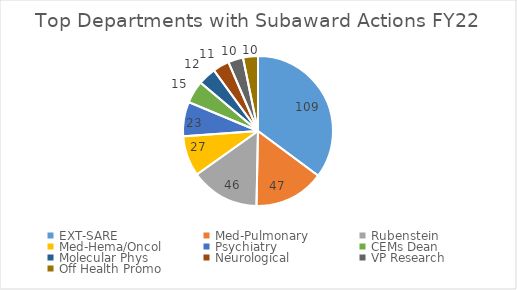
| Category | FY22 |
|---|---|
| EXT-SARE | 109 |
| Med-Pulmonary | 47 |
| Rubenstein | 46 |
| Med-Hema/Oncol | 27 |
| Psychiatry | 23 |
| CEMs Dean | 15 |
| Molecular Phys | 12 |
| Neurological | 11 |
| VP Research | 10 |
| Off Health Promo | 10 |